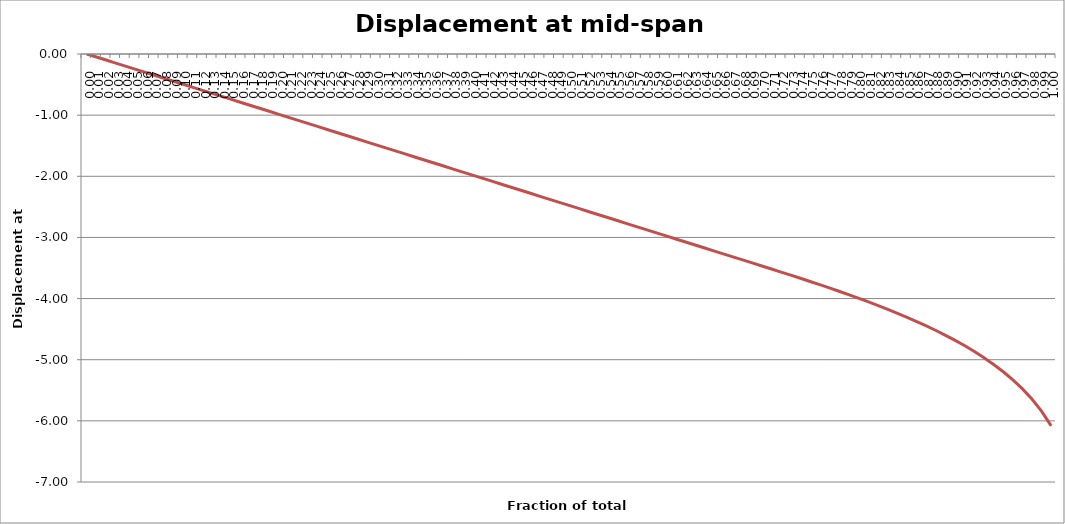
| Category | Displacement at mid-span [mm] |
|---|---|
| 0.0 | 0 |
| 0.01 | -0.05 |
| 0.02 | -0.099 |
| 0.03 | -0.149 |
| 0.04 | -0.198 |
| 0.05 | -0.248 |
| 0.06 | -0.297 |
| 0.06999999999999999 | -0.347 |
| 0.08 | -0.396 |
| 0.09 | -0.446 |
| 0.1 | -0.495 |
| 0.11000000000000001 | -0.545 |
| 0.12 | -0.594 |
| 0.13 | -0.644 |
| 0.13999999999999999 | -0.693 |
| 0.15 | -0.743 |
| 0.16 | -0.792 |
| 0.16999999999999998 | -0.842 |
| 0.18 | -0.891 |
| 0.19 | -0.941 |
| 0.2 | -0.99 |
| 0.21000000000000002 | -1.04 |
| 0.22000000000000003 | -1.09 |
| 0.22999999999999998 | -1.139 |
| 0.24 | -1.189 |
| 0.25 | -1.238 |
| 0.26 | -1.288 |
| 0.27 | -1.337 |
| 0.27999999999999997 | -1.387 |
| 0.29 | -1.436 |
| 0.3 | -1.486 |
| 0.31 | -1.535 |
| 0.32 | -1.585 |
| 0.32999999999999996 | -1.634 |
| 0.33999999999999997 | -1.684 |
| 0.35 | -1.733 |
| 0.36 | -1.783 |
| 0.37 | -1.832 |
| 0.38 | -1.882 |
| 0.39 | -1.931 |
| 0.4 | -1.981 |
| 0.41 | -2.03 |
| 0.42000000000000004 | -2.08 |
| 0.43 | -2.13 |
| 0.44000000000000006 | -2.179 |
| 0.45 | -2.228 |
| 0.45999999999999996 | -2.278 |
| 0.47000000000000003 | -2.328 |
| 0.48 | -2.377 |
| 0.49000000000000005 | -2.427 |
| 0.5 | -2.476 |
| 0.51 | -2.526 |
| 0.52 | -2.575 |
| 0.53 | -2.625 |
| 0.54 | -2.674 |
| 0.55 | -2.724 |
| 0.5599999999999999 | -2.773 |
| 0.5700000000000001 | -2.823 |
| 0.58 | -2.872 |
| 0.5900000000000001 | -2.922 |
| 0.6 | -2.971 |
| 0.61 | -3.021 |
| 0.62 | -3.07 |
| 0.63 | -3.12 |
| 0.64 | -3.169 |
| 0.65 | -3.219 |
| 0.6599999999999999 | -3.268 |
| 0.67 | -3.318 |
| 0.6799999999999999 | -3.368 |
| 0.6900000000000001 | -3.417 |
| 0.7 | -3.466 |
| 0.71 | -3.516 |
| 0.72 | -3.567 |
| 0.73 | -3.618 |
| 0.74 | -3.668 |
| 0.75 | -3.72 |
| 0.76 | -3.773 |
| 0.77 | -3.826 |
| 0.78 | -3.88 |
| 0.79 | -3.936 |
| 0.8 | -3.993 |
| 0.8099999999999999 | -4.051 |
| 0.82 | -4.111 |
| 0.8300000000000001 | -4.173 |
| 0.8400000000000001 | -4.236 |
| 0.85 | -4.302 |
| 0.86 | -4.371 |
| 0.8699999999999999 | -4.443 |
| 0.8800000000000001 | -4.518 |
| 0.89 | -4.597 |
| 0.9 | -4.68 |
| 0.9099999999999999 | -4.769 |
| 0.9199999999999999 | -4.863 |
| 0.93 | -4.964 |
| 0.9400000000000001 | -5.074 |
| 0.95 | -5.193 |
| 0.96 | -5.326 |
| 0.97 | -5.474 |
| 0.9800000000000001 | -5.644 |
| 0.99 | -5.841 |
| 1.0 | -6.082 |